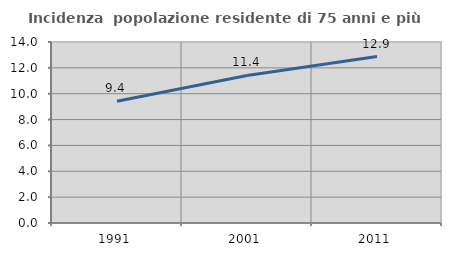
| Category | Incidenza  popolazione residente di 75 anni e più |
|---|---|
| 1991.0 | 9.424 |
| 2001.0 | 11.415 |
| 2011.0 | 12.876 |